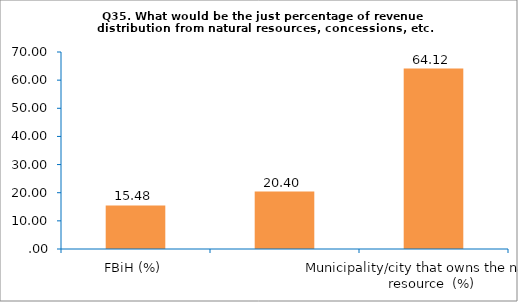
| Category | Series 0 |
|---|---|
| FBiH (%) | 15.483 |
| Canton that owns the natural resource  (%) | 20.397 |
| Municipality/city that owns the natural resource  (%) | 64.121 |